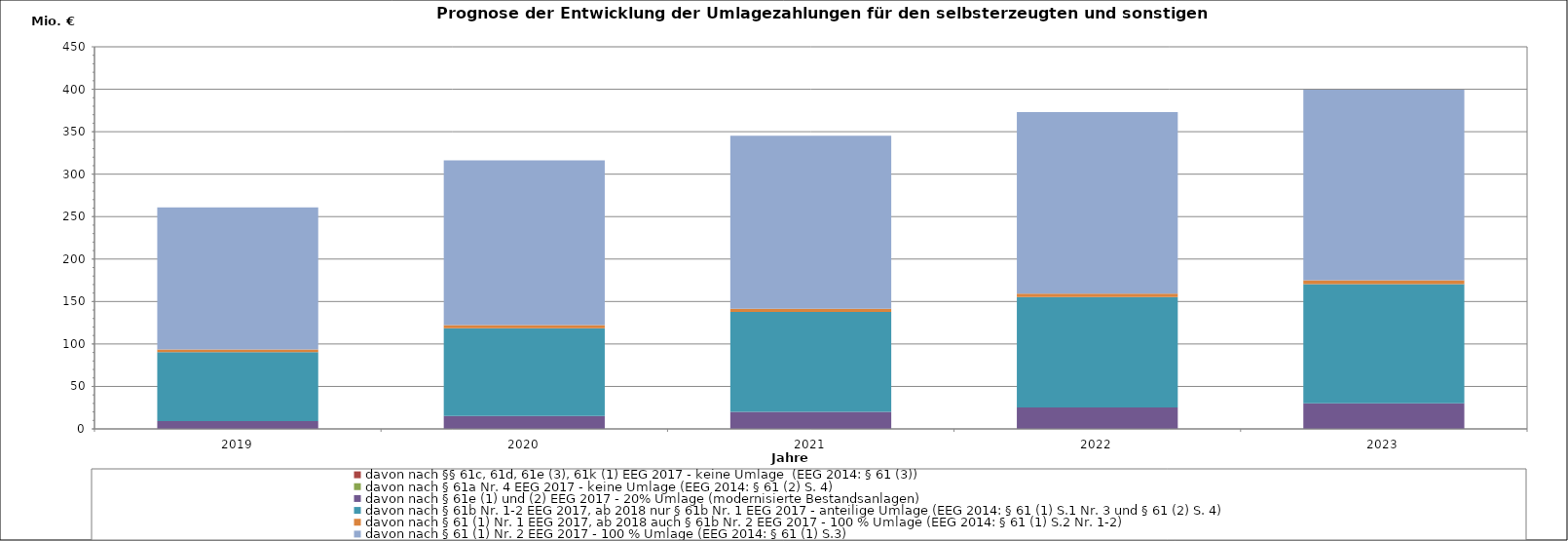
| Category |  davon nach §§ 61c, 61d, 61e (3), 61k (1) EEG 2017 - keine Umlage  (EEG 2014: § 61 (3))  |  davon nach § 61a Nr. 4 EEG 2017 - keine Umlage (EEG 2014: § 61 (2) S. 4)  |  davon nach § 61e (1) und (2) EEG 2017 - 20% Umlage (modernisierte Bestandsanlagen)  |  davon nach § 61b Nr. 1-2 EEG 2017, ab 2018 nur § 61b Nr. 1 EEG 2017 - anteilige Umlage (EEG 2014: § 61 (1) S.1 Nr. 3 und § 61 (2) S. 4)  |  davon nach § 61 (1) Nr. 1 EEG 2017, ab 2018 auch § 61b Nr. 2 EEG 2017 - 100 % Umlage (EEG 2014: § 61 (1) S.2 Nr. 1-2)  |  davon nach § 61 (1) Nr. 2 EEG 2017 - 100 % Umlage (EEG 2014: § 61 (1) S.3)  |
|---|---|---|---|---|---|---|
| 2019.0 | 0 | 0 | 9.211 | 81.064 | 3.22 | 167.311 |
| 2020.0 | 0 | 0 | 15.191 | 103.388 | 3.734 | 193.989 |
| 2021.0 | 0 | 0 | 20.168 | 117.494 | 3.921 | 203.688 |
| 2022.0 | 0 | 0 | 25.113 | 130.083 | 4.117 | 213.873 |
| 2023.0 | 0 | 0 | 30.025 | 140.573 | 4.323 | 224.566 |